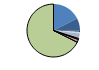
| Category | Series 0 |
|---|---|
| ARRASTRE | 173 |
| CERCO | 75 |
| ATUNEROS CAÑEROS | 8 |
| PALANGRE DE FONDO | 9 |
| PALANGRE DE SUPERFICIE | 25 |
| RASCO | 6 |
| VOLANTA | 6 |
| ARTES FIJAS | 18 |
| ARTES MENORES | 670 |